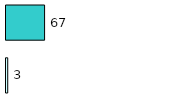
| Category | Series 0 | Series 1 |
|---|---|---|
| 0 | 3 | 67 |